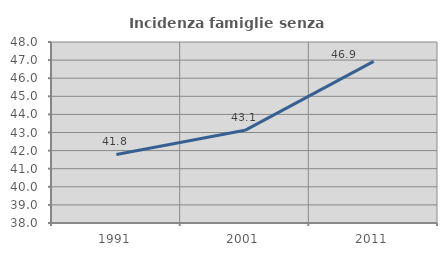
| Category | Incidenza famiglie senza nuclei |
|---|---|
| 1991.0 | 41.785 |
| 2001.0 | 43.121 |
| 2011.0 | 46.93 |